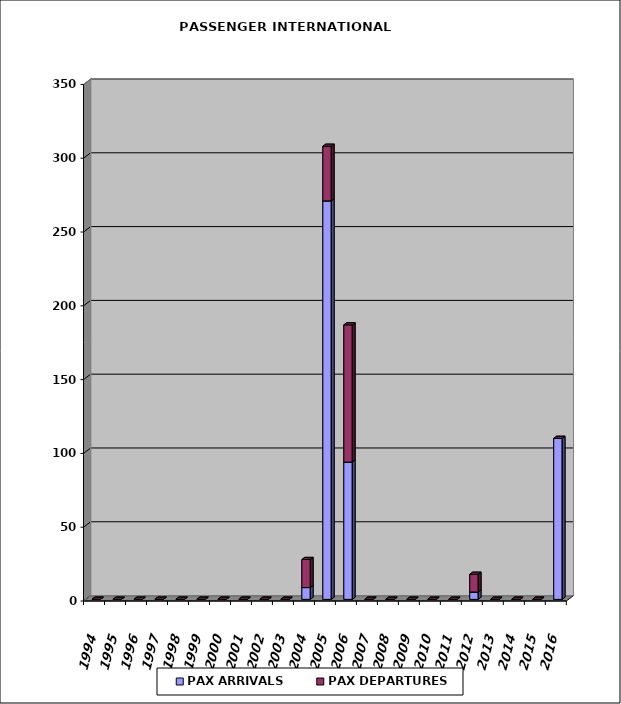
| Category | PAX ARRIVALS | PAX DEPARTURES |
|---|---|---|
| 1994.0 | 0 | 0 |
| 1995.0 | 0 | 0 |
| 1996.0 | 0 | 0 |
| 1997.0 | 0 | 0 |
| 1998.0 | 0 | 0 |
| 1999.0 | 0 | 0 |
| 2000.0 | 0 | 0 |
| 2001.0 | 0 | 0 |
| 2002.0 | 0 | 0 |
| 2003.0 | 0 | 0 |
| 2004.0 | 8 | 19 |
| 2005.0 | 270 | 37 |
| 2006.0 | 93 | 93 |
| 2007.0 | 0 | 0 |
| 2008.0 | 0 | 0 |
| 2009.0 | 0 | 0 |
| 2010.0 | 0 | 0 |
| 2011.0 | 0 | 0 |
| 2012.0 | 5 | 12 |
| 2013.0 | 0 | 0 |
| 2014.0 | 0 | 0 |
| 2015.0 | 0 | 0 |
| 2016.0 | 109 | 0 |